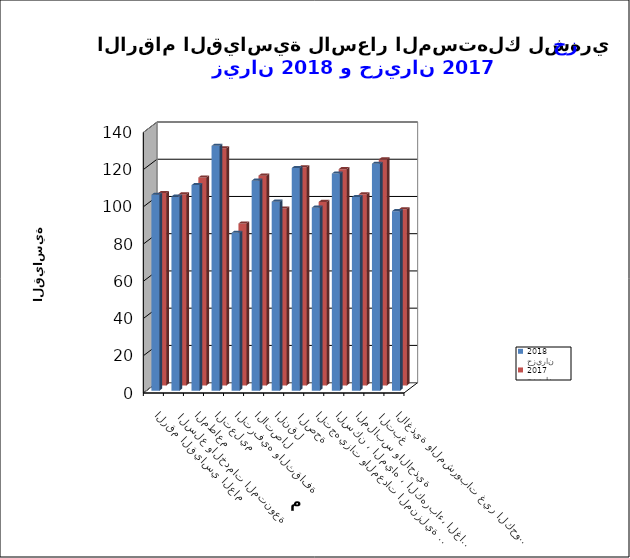
| Category | حزيران 2018      | حزيران 2017 |
|---|---|---|
| الاغذية والمشروبات غير الكحولية | 96.4 | 94.6 |
|  التبغ | 121.9 | 121.4 |
| الملابس والاحذية | 104 | 102.7 |
| السكن ، المياه ، الكهرباء، الغاز  | 116.6 | 116.2 |
| التجهيزات والمعدات المنزلية والصيانة | 98.3 | 98.6 |
|  الصحة | 119.6 | 117.2 |
| النقل | 101.5 | 95 |
| الاتصال | 112.8 | 112.7 |
| الترفيه والثقافة | 84.8 | 87 |
| التعليم | 131.5 | 127.4 |
| المطاعم  | 110.4 | 111.7 |
|  السلع والخدمات المتنوعة | 104.3 | 102.6 |
| الرقم القياسي العام | 105.2 | 103.4 |